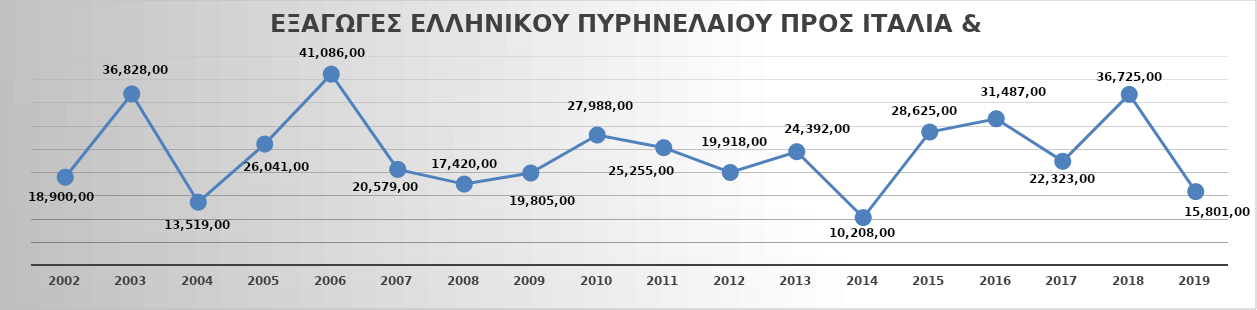
| Category | ΠΡΟΣ ΙΤΑΛΙΑ+ΙΣΠΑΝΙΑ |
|---|---|
| 2002 | 18900000 |
| 2003 | 36828000 |
| 2004 | 13519000 |
| 2005 | 26041000 |
| 2006 | 41086000 |
| 2007 | 20579000 |
| 2008 | 17420000 |
| 2009 | 19805000 |
| 2010 | 27988000 |
| 2011 | 25255000 |
| 2012 | 19918000 |
| 2013 | 24392000 |
| 2014 | 10208000 |
| 2015 | 28625000 |
| 2016 | 31487000 |
| 2017 | 22323000 |
| 2018 | 36725000 |
| 2019 | 15801000 |